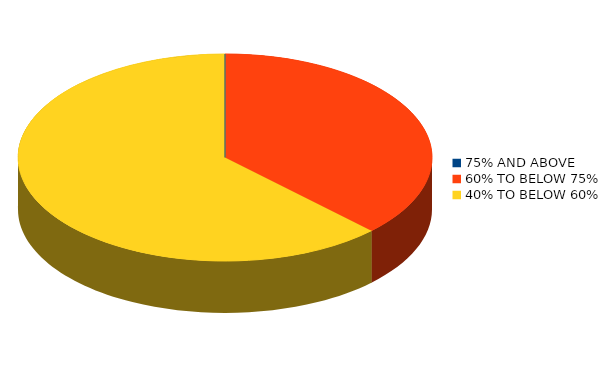
| Category | Number of students |
|---|---|
| 75% AND ABOVE | 0 |
| 60% TO BELOW 75% | 3 |
| 40% TO BELOW 60% | 5 |